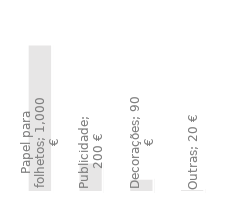
| Category | Despesas Anuais |
|---|---|
| Papel para folhetos | 1000 |
| Publicidade | 200 |
| Decorações | 90 |
| Outras | 20 |